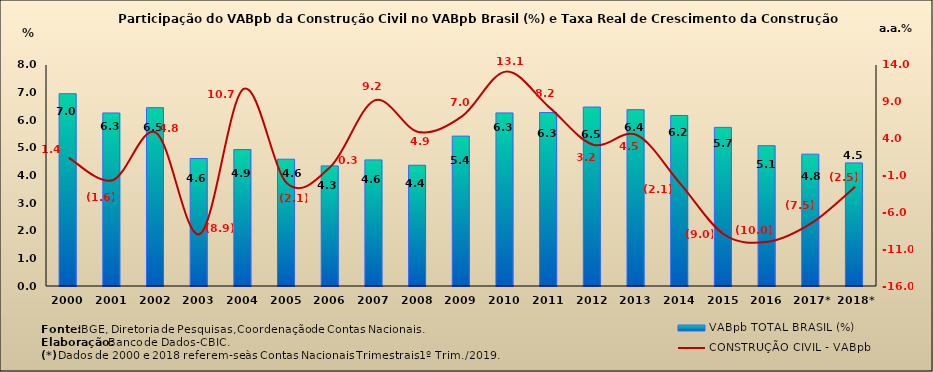
| Category | VABpb TOTAL BRASIL (%) |
|---|---|
| 2000 | 6.96 |
| 2001 | 6.264 |
| 2002 | 6.454 |
| 2003 | 4.615 |
| 2004 | 4.937 |
| 2005 | 4.589 |
| 2006 | 4.348 |
| 2007 | 4.564 |
| 2008 | 4.371 |
| 2009 | 5.426 |
| 2010 | 6.265 |
| 2011 | 6.277 |
| 2012 | 6.478 |
| 2013 | 6.382 |
| 2014 | 6.173 |
| 2015 | 5.742 |
| 2016 | 5.078 |
| 2017* | 4.772 |
| 2018* | 4.456 |